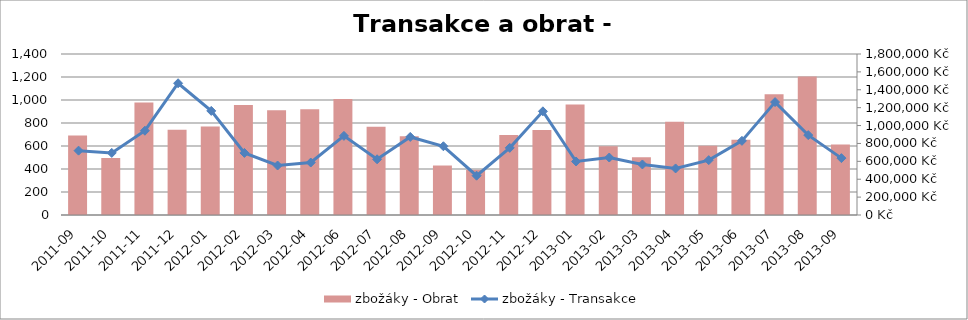
| Category | zbožáky - Obrat |
|---|---|
| 2011-09 | 888372.105 |
| 2011-10 | 637314.178 |
| 2011-11 | 1257691.446 |
| 2011-12 | 952360.74 |
| 2012-01 | 989167.461 |
| 2012-02 | 1228994.704 |
| 2012-03 | 1171353.023 |
| 2012-04 | 1182778.366 |
| 2012-06 | 1295872.224 |
| 2012-07 | 986126.044 |
| 2012-08 | 880622.419 |
| 2012-09 | 553269.568 |
| 2012-10 | 505123.717 |
| 2012-11 | 895701.9 |
| 2012-12 | 950837.955 |
| 2013-01 | 1235363.624 |
| 2013-02 | 768342.314 |
| 2013-03 | 646511.611 |
| 2013-04 | 1042691.32 |
| 2013-05 | 775564.973 |
| 2013-06 | 840056.811 |
| 2013-07 | 1349593.547 |
| 2013-08 | 1547191.43 |
| 2013-09 | 789571.622 |